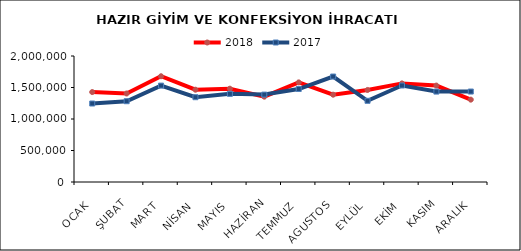
| Category | 2018 | 2017 |
|---|---|---|
| OCAK | 1427587.842 | 1245596.353 |
| ŞUBAT | 1405048.237 | 1282246.549 |
| MART | 1678479.006 | 1529885.327 |
| NİSAN | 1464998.088 | 1345753.293 |
| MAYIS | 1481022.144 | 1399025.766 |
| HAZİRAN | 1354511.325 | 1387348.122 |
| TEMMUZ | 1581259.284 | 1476023.36 |
| AGUSTOS | 1385807.995 | 1674098.993 |
| EYLÜL | 1460826.408 | 1288890.579 |
| EKİM | 1564977.93 | 1531449.831 |
| KASIM | 1530640.915 | 1435140.665 |
| ARALIK | 1306997.371 | 1435809.881 |